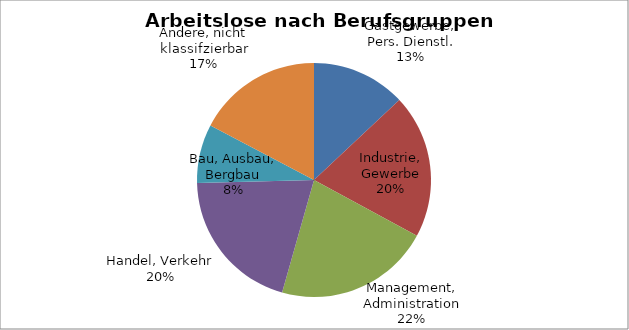
| Category | Series 0 |
|---|---|
| Gastgewerbe, Pers. Dienstl. | 0.13 |
| Industrie, Gewerbe | 0.199 |
| Management, Administration | 0.215 |
| Handel, Verkehr | 0.202 |
| Bau, Ausbau, Bergbau | 0.081 |
| Andere, nicht klassifzierbar | 0.173 |